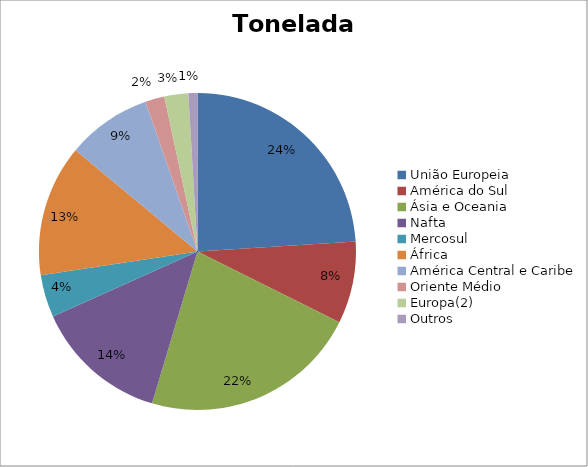
| Category | Series 0 |
|---|---|
| União Europeia | 4201256.806 |
| América do Sul | 1465963.311 |
| Ásia e Oceania | 3900300.663 |
| Nafta | 2388771.639 |
| Mercosul | 759811.286 |
| África | 2352197.704 |
| América Central e Caribe | 1512403.423 |
| Oriente Médio | 344030.577 |
| Europa(2) | 426128.377 |
| Outros | 162247.904 |